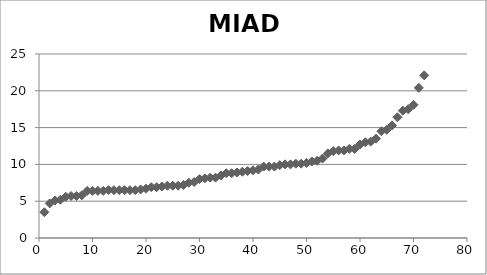
| Category | MIAD |
|---|---|
| 1.0 | 3.5 |
| 2.0 | 4.7 |
| 3.0 | 5.1 |
| 4.0 | 5.2 |
| 5.0 | 5.6 |
| 6.0 | 5.7 |
| 7.0 | 5.7 |
| 8.0 | 5.8 |
| 9.0 | 6.4 |
| 10.0 | 6.4 |
| 11.0 | 6.4 |
| 12.0 | 6.4 |
| 13.0 | 6.5 |
| 14.0 | 6.5 |
| 15.0 | 6.5 |
| 16.0 | 6.5 |
| 17.0 | 6.5 |
| 18.0 | 6.5 |
| 19.0 | 6.6 |
| 20.0 | 6.7 |
| 21.0 | 6.9 |
| 22.0 | 6.9 |
| 23.0 | 7 |
| 24.0 | 7.1 |
| 25.0 | 7.1 |
| 26.0 | 7.1 |
| 27.0 | 7.2 |
| 28.0 | 7.5 |
| 29.0 | 7.6 |
| 30.0 | 8 |
| 31.0 | 8.1 |
| 32.0 | 8.2 |
| 33.0 | 8.2 |
| 34.0 | 8.5 |
| 35.0 | 8.8 |
| 36.0 | 8.8 |
| 37.0 | 8.9 |
| 38.0 | 9 |
| 39.0 | 9.1 |
| 40.0 | 9.2 |
| 41.0 | 9.3 |
| 42.0 | 9.7 |
| 43.0 | 9.7 |
| 44.0 | 9.7 |
| 45.0 | 9.9 |
| 46.0 | 10 |
| 47.0 | 10 |
| 48.0 | 10.1 |
| 49.0 | 10.1 |
| 50.0 | 10.2 |
| 51.0 | 10.4 |
| 52.0 | 10.5 |
| 53.0 | 10.8 |
| 54.0 | 11.5 |
| 55.0 | 11.8 |
| 56.0 | 11.9 |
| 57.0 | 11.9 |
| 58.0 | 12.1 |
| 59.0 | 12.1 |
| 60.0 | 12.7 |
| 61.0 | 13 |
| 62.0 | 13.1 |
| 63.0 | 13.5 |
| 64.0 | 14.5 |
| 65.0 | 14.7 |
| 66.0 | 15.3 |
| 67.0 | 16.4 |
| 68.0 | 17.3 |
| 69.0 | 17.5 |
| 70.0 | 18.1 |
| 71.0 | 20.4 |
| 72.0 | 22.1 |